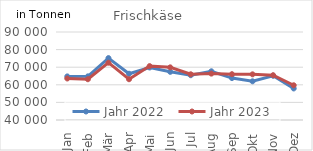
| Category | Jahr 2022 | Jahr 2023 |
|---|---|---|
| Jan | 64773.221 | 63584.152 |
| Feb | 64792.523 | 63165.812 |
| Mär | 75175.818 | 72555.202 |
| Apr | 66285.836 | 63160.538 |
| Mai | 69843.014 | 70623.76 |
| Jun | 67362.8 | 69915.49 |
| Jul | 65447.33 | 65970.119 |
| Aug | 67681.625 | 66355.361 |
| Sep | 63820.734 | 66034.617 |
| Okt | 61990.169 | 65943.767 |
| Nov | 65138.806 | 65446.046 |
| Dez | 57920.715 | 59736.12 |